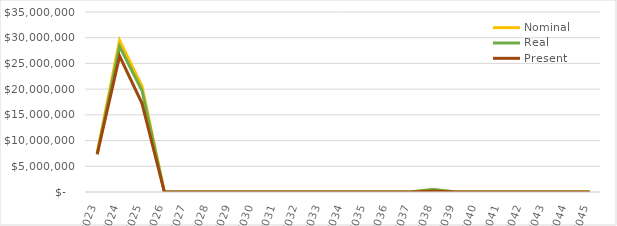
| Category | Nominal | Real | Present |
|---|---|---|---|
| 2023.0 | 7644733.833 | 7338944.48 | 7338944.48 |
| 2024.0 | 29456589.165 | 28278325.598 | 26428341.681 |
| 2025.0 | 20559415.332 | 19737038.719 | 17239093.998 |
| 2026.0 | 0 | 0 | 0 |
| 2027.0 | 0 | 0 | 0 |
| 2028.0 | 0 | 0 | 0 |
| 2029.0 | 0 | 0 | 0 |
| 2030.0 | 0 | 0 | 0 |
| 2031.0 | 0 | 0 | 0 |
| 2032.0 | 0 | 0 | 0 |
| 2033.0 | 0 | 0 | 0 |
| 2034.0 | 0 | 0 | 0 |
| 2035.0 | 0 | 0 | 0 |
| 2036.0 | 0 | 0 | 0 |
| 2037.0 | 0 | 0 | 0 |
| 2038.0 | 500000 | 480000 | 173974.089 |
| 2039.0 | 0 | 0 | 0 |
| 2040.0 | 0 | 0 | 0 |
| 2041.0 | 0 | 0 | 0 |
| 2042.0 | 0 | 0 | 0 |
| 2043.0 | 0 | 0 | 0 |
| 2044.0 | 0 | 0 | 0 |
| 2045.0 | 0 | 0 | 0 |